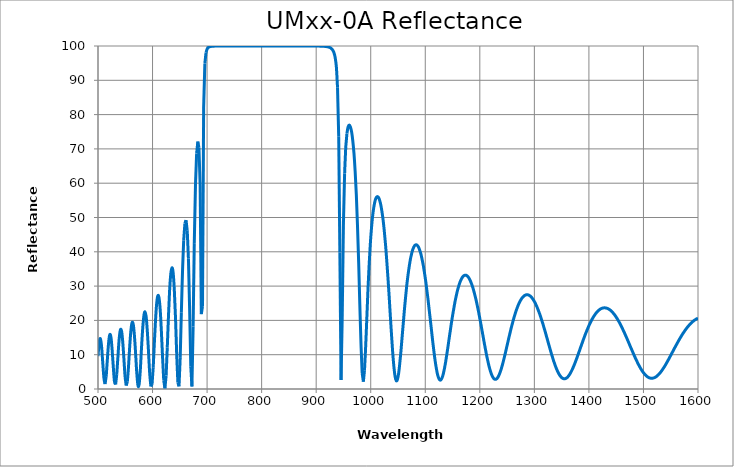
| Category | Series 0 |
|---|---|
| 500.0 | 9.57 |
| 502.2 | 13.56 |
| 504.3 | 14.68 |
| 506.5 | 12.51 |
| 508.6 | 7.95 |
| 510.8 | 3.28 |
| 512.9 | 1.44 |
| 515.1 | 3.77 |
| 517.2 | 8.71 |
| 519.4 | 13.4 |
| 521.5 | 15.81 |
| 523.7 | 15.15 |
| 525.8 | 11.64 |
| 528.0 | 6.57 |
| 530.1 | 2.28 |
| 532.3 | 1.32 |
| 534.4 | 4.34 |
| 536.6 | 9.57 |
| 538.7 | 14.42 |
| 540.9 | 17.14 |
| 543.1 | 16.98 |
| 545.2 | 14.02 |
| 547.4 | 9.05 |
| 549.5 | 3.89 |
| 551.7 | 1.01 |
| 553.8 | 2.11 |
| 556.0 | 6.63 |
| 558.1 | 12.33 |
| 560.3 | 16.98 |
| 562.4 | 19.32 |
| 564.6 | 18.87 |
| 566.7 | 15.71 |
| 568.9 | 10.52 |
| 571.0 | 4.87 |
| 573.2 | 1.1 |
| 575.3 | 1.24 |
| 577.5 | 5.36 |
| 579.6 | 11.5 |
| 581.8 | 17.31 |
| 584.0 | 21.21 |
| 586.1 | 22.52 |
| 588.3 | 21.02 |
| 590.4 | 16.92 |
| 592.6 | 10.92 |
| 594.7 | 4.69 |
| 596.9 | 0.76 |
| 599.0 | 1.27 |
| 601.2 | 6.2 |
| 603.3 | 13.34 |
| 605.5 | 20.15 |
| 607.6 | 25.01 |
| 609.8 | 27.21 |
| 611.9 | 26.53 |
| 614.1 | 22.95 |
| 616.2 | 16.8 |
| 618.4 | 9.18 |
| 620.5 | 2.55 |
| 622.7 | 0.2 |
| 624.9 | 3.91 |
| 627.0 | 12.05 |
| 629.2 | 21.22 |
| 631.3 | 28.81 |
| 633.5 | 33.64 |
| 635.6 | 35.36 |
| 637.8 | 33.84 |
| 639.9 | 28.94 |
| 642.1 | 20.74 |
| 644.2 | 10.47 |
| 646.4 | 1.91 |
| 648.5 | 0.77 |
| 650.7 | 9.07 |
| 652.8 | 22.24 |
| 655.0 | 34.56 |
| 657.1 | 43.37 |
| 659.3 | 48.23 |
| 661.4 | 49.23 |
| 663.6 | 46.12 |
| 665.8 | 38.01 |
| 667.9 | 23.88 |
| 670.1 | 6.56 |
| 672.2 | 0.75 |
| 674.4 | 18.24 |
| 676.5 | 42.53 |
| 678.7 | 59.47 |
| 680.8 | 68.63 |
| 683.0 | 72.14 |
| 685.1 | 70.33 |
| 687.3 | 59.17 |
| 689.4 | 21.83 |
| 691.6 | 24.13 |
| 693.7 | 82.24 |
| 695.9 | 94.91 |
| 698.0 | 98.08 |
| 700.2 | 99.14 |
| 702.3 | 99.56 |
| 704.5 | 99.76 |
| 706.7 | 99.86 |
| 708.8 | 99.91 |
| 711.0 | 99.94 |
| 713.1 | 99.96 |
| 715.3 | 99.97 |
| 717.4 | 99.98 |
| 719.6 | 99.99 |
| 721.7 | 99.99 |
| 723.9 | 99.99 |
| 726.0 | 99.99 |
| 728.2 | 100 |
| 730.3 | 100 |
| 732.5 | 100 |
| 734.6 | 100 |
| 736.8 | 100 |
| 738.9 | 100 |
| 741.1 | 100 |
| 743.2 | 100 |
| 745.4 | 100 |
| 747.6 | 100 |
| 749.7 | 100 |
| 751.9 | 100 |
| 754.0 | 100 |
| 756.2 | 100 |
| 758.3 | 100 |
| 760.5 | 100 |
| 762.6 | 100 |
| 764.8 | 100 |
| 766.9 | 100 |
| 769.1 | 100 |
| 771.2 | 100 |
| 773.4 | 100 |
| 775.5 | 100 |
| 777.7 | 100 |
| 779.8 | 100 |
| 782.0 | 100 |
| 784.1 | 100 |
| 786.3 | 100 |
| 788.5 | 100 |
| 790.6 | 100 |
| 792.8 | 100 |
| 794.9 | 100 |
| 797.1 | 100 |
| 799.2 | 100 |
| 801.4 | 100 |
| 803.5 | 100 |
| 805.7 | 100 |
| 807.8 | 100 |
| 810.0 | 100 |
| 812.1 | 100 |
| 814.3 | 100 |
| 816.4 | 100 |
| 818.6 | 100 |
| 820.7 | 100 |
| 822.9 | 100 |
| 825.0 | 100 |
| 827.2 | 100 |
| 829.4 | 100 |
| 831.5 | 100 |
| 833.7 | 100 |
| 835.8 | 100 |
| 838.0 | 100 |
| 840.1 | 100 |
| 842.3 | 100 |
| 844.4 | 100 |
| 846.6 | 100 |
| 848.7 | 100 |
| 850.9 | 100 |
| 853.0 | 100 |
| 855.2 | 100 |
| 857.3 | 100 |
| 859.5 | 100 |
| 861.6 | 100 |
| 863.8 | 100 |
| 865.9 | 100 |
| 868.1 | 100 |
| 870.3 | 100 |
| 872.4 | 100 |
| 874.6 | 100 |
| 876.7 | 100 |
| 878.9 | 100 |
| 881.0 | 100 |
| 883.2 | 100 |
| 885.3 | 99.99 |
| 887.5 | 99.99 |
| 889.6 | 99.99 |
| 891.8 | 99.99 |
| 893.9 | 99.99 |
| 896.1 | 99.99 |
| 898.2 | 99.98 |
| 900.4 | 99.98 |
| 902.5 | 99.98 |
| 904.7 | 99.97 |
| 906.8 | 99.96 |
| 909.0 | 99.95 |
| 911.2 | 99.94 |
| 913.3 | 99.92 |
| 915.5 | 99.89 |
| 917.6 | 99.85 |
| 919.8 | 99.8 |
| 921.9 | 99.73 |
| 924.1 | 99.62 |
| 926.2 | 99.45 |
| 928.4 | 99.18 |
| 930.5 | 98.74 |
| 932.7 | 97.99 |
| 934.8 | 96.61 |
| 937.0 | 93.9 |
| 939.1 | 87.98 |
| 941.3 | 73.68 |
| 943.4 | 39.78 |
| 945.6 | 2.61 |
| 947.7 | 20.72 |
| 949.9 | 47.8 |
| 952.1 | 62.82 |
| 954.2 | 70.54 |
| 956.4 | 74.53 |
| 958.5 | 76.42 |
| 960.7 | 76.94 |
| 962.8 | 76.41 |
| 965.0 | 74.9 |
| 967.1 | 72.38 |
| 969.3 | 68.68 |
| 971.4 | 63.55 |
| 973.6 | 56.67 |
| 975.7 | 47.77 |
| 977.9 | 36.84 |
| 980.0 | 24.6 |
| 982.2 | 12.92 |
| 984.3 | 4.66 |
| 986.5 | 2.13 |
| 988.6 | 5.47 |
| 990.8 | 12.68 |
| 993.0 | 21.3 |
| 995.1 | 29.63 |
| 997.3 | 36.84 |
| 999.4 | 42.7 |
| 1001.6 | 47.29 |
| 1003.7 | 50.74 |
| 1005.9 | 53.23 |
| 1008.0 | 54.89 |
| 1010.2 | 55.82 |
| 1012.3 | 56.1 |
| 1014.5 | 55.78 |
| 1016.6 | 54.88 |
| 1018.8 | 53.41 |
| 1020.9 | 51.37 |
| 1023.1 | 48.73 |
| 1025.2 | 45.48 |
| 1027.4 | 41.61 |
| 1029.5 | 37.15 |
| 1031.7 | 32.15 |
| 1033.9 | 26.73 |
| 1036.0 | 21.11 |
| 1038.2 | 15.6 |
| 1040.3 | 10.58 |
| 1042.5 | 6.48 |
| 1044.6 | 3.68 |
| 1046.8 | 2.42 |
| 1048.9 | 2.74 |
| 1051.1 | 4.5 |
| 1053.2 | 7.39 |
| 1055.4 | 11.03 |
| 1057.5 | 15.07 |
| 1059.7 | 19.21 |
| 1061.8 | 23.21 |
| 1064.0 | 26.92 |
| 1066.1 | 30.25 |
| 1068.3 | 33.17 |
| 1070.5 | 35.65 |
| 1072.6 | 37.7 |
| 1074.8 | 39.34 |
| 1076.9 | 40.57 |
| 1079.1 | 41.42 |
| 1081.2 | 41.91 |
| 1083.4 | 42.05 |
| 1085.5 | 41.85 |
| 1087.7 | 41.32 |
| 1089.8 | 40.48 |
| 1092.0 | 39.32 |
| 1094.1 | 37.85 |
| 1096.3 | 36.08 |
| 1098.4 | 34.02 |
| 1100.6 | 31.69 |
| 1102.7 | 29.1 |
| 1104.9 | 26.3 |
| 1107.0 | 23.33 |
| 1109.2 | 20.24 |
| 1111.4 | 17.12 |
| 1113.5 | 14.06 |
| 1115.7 | 11.16 |
| 1117.8 | 8.53 |
| 1120.0 | 6.28 |
| 1122.1 | 4.51 |
| 1124.3 | 3.29 |
| 1126.4 | 2.67 |
| 1128.6 | 2.66 |
| 1130.7 | 3.23 |
| 1132.9 | 4.32 |
| 1135.0 | 5.86 |
| 1137.2 | 7.75 |
| 1139.3 | 9.9 |
| 1141.5 | 12.2 |
| 1143.6 | 14.57 |
| 1145.8 | 16.93 |
| 1147.9 | 19.24 |
| 1150.1 | 21.43 |
| 1152.3 | 23.47 |
| 1154.4 | 25.34 |
| 1156.6 | 27.03 |
| 1158.7 | 28.51 |
| 1160.9 | 29.79 |
| 1163.0 | 30.86 |
| 1165.2 | 31.73 |
| 1167.3 | 32.39 |
| 1169.5 | 32.86 |
| 1171.6 | 33.12 |
| 1173.8 | 33.19 |
| 1175.9 | 33.08 |
| 1178.1 | 32.77 |
| 1180.2 | 32.29 |
| 1182.4 | 31.63 |
| 1184.5 | 30.8 |
| 1186.7 | 29.81 |
| 1188.8 | 28.66 |
| 1191.0 | 27.35 |
| 1193.2 | 25.91 |
| 1195.3 | 24.35 |
| 1197.5 | 22.67 |
| 1199.6 | 20.9 |
| 1201.8 | 19.06 |
| 1203.9 | 17.17 |
| 1206.1 | 15.27 |
| 1208.2 | 13.38 |
| 1210.4 | 11.54 |
| 1212.5 | 9.79 |
| 1214.7 | 8.17 |
| 1216.8 | 6.71 |
| 1219.0 | 5.44 |
| 1221.1 | 4.4 |
| 1223.3 | 3.61 |
| 1225.4 | 3.08 |
| 1227.6 | 2.83 |
| 1229.7 | 2.85 |
| 1231.9 | 3.14 |
| 1234.1 | 3.68 |
| 1236.2 | 4.44 |
| 1238.4 | 5.4 |
| 1240.5 | 6.53 |
| 1242.7 | 7.8 |
| 1244.8 | 9.16 |
| 1247.0 | 10.6 |
| 1249.1 | 12.08 |
| 1251.3 | 13.57 |
| 1253.4 | 15.05 |
| 1255.6 | 16.49 |
| 1257.7 | 17.89 |
| 1259.9 | 19.21 |
| 1262.0 | 20.46 |
| 1264.2 | 21.63 |
| 1266.3 | 22.69 |
| 1268.5 | 23.66 |
| 1270.6 | 24.52 |
| 1272.8 | 25.27 |
| 1275.0 | 25.92 |
| 1277.1 | 26.45 |
| 1279.3 | 26.87 |
| 1281.4 | 27.18 |
| 1283.6 | 27.39 |
| 1285.7 | 27.48 |
| 1287.9 | 27.47 |
| 1290.0 | 27.35 |
| 1292.2 | 27.13 |
| 1294.3 | 26.81 |
| 1296.5 | 26.4 |
| 1298.6 | 25.88 |
| 1300.8 | 25.28 |
| 1302.9 | 24.59 |
| 1305.1 | 23.81 |
| 1307.2 | 22.95 |
| 1309.4 | 22.02 |
| 1311.5 | 21.03 |
| 1313.7 | 19.97 |
| 1315.9 | 18.86 |
| 1318.0 | 17.7 |
| 1320.2 | 16.52 |
| 1322.3 | 15.31 |
| 1324.5 | 14.08 |
| 1326.6 | 12.86 |
| 1328.8 | 11.65 |
| 1330.9 | 10.47 |
| 1333.1 | 9.34 |
| 1335.2 | 8.25 |
| 1337.4 | 7.24 |
| 1339.5 | 6.31 |
| 1341.7 | 5.48 |
| 1343.8 | 4.75 |
| 1346.0 | 4.14 |
| 1348.1 | 3.66 |
| 1350.3 | 3.3 |
| 1352.4 | 3.08 |
| 1354.6 | 2.99 |
| 1356.8 | 3.03 |
| 1358.9 | 3.2 |
| 1361.1 | 3.5 |
| 1363.2 | 3.92 |
| 1365.4 | 4.44 |
| 1367.5 | 5.06 |
| 1369.7 | 5.76 |
| 1371.8 | 6.54 |
| 1374.0 | 7.38 |
| 1376.1 | 8.27 |
| 1378.3 | 9.2 |
| 1380.4 | 10.16 |
| 1382.6 | 11.13 |
| 1384.7 | 12.1 |
| 1386.9 | 13.07 |
| 1389.0 | 14.03 |
| 1391.2 | 14.97 |
| 1393.3 | 15.88 |
| 1395.5 | 16.75 |
| 1397.7 | 17.59 |
| 1399.8 | 18.38 |
| 1402.0 | 19.12 |
| 1404.1 | 19.82 |
| 1406.3 | 20.46 |
| 1408.4 | 21.04 |
| 1410.6 | 21.57 |
| 1412.7 | 22.04 |
| 1414.9 | 22.45 |
| 1417.0 | 22.81 |
| 1419.2 | 23.1 |
| 1421.3 | 23.33 |
| 1423.5 | 23.5 |
| 1425.6 | 23.61 |
| 1427.8 | 23.66 |
| 1429.9 | 23.65 |
| 1432.1 | 23.59 |
| 1434.2 | 23.47 |
| 1436.4 | 23.29 |
| 1438.6 | 23.06 |
| 1440.7 | 22.77 |
| 1442.9 | 22.43 |
| 1445.0 | 22.04 |
| 1447.2 | 21.61 |
| 1449.3 | 21.12 |
| 1451.5 | 20.59 |
| 1453.6 | 20.02 |
| 1455.8 | 19.41 |
| 1457.9 | 18.77 |
| 1460.1 | 18.09 |
| 1462.2 | 17.37 |
| 1464.4 | 16.64 |
| 1466.5 | 15.88 |
| 1468.7 | 15.1 |
| 1470.8 | 14.31 |
| 1473.0 | 13.5 |
| 1475.1 | 12.7 |
| 1477.3 | 11.89 |
| 1479.5 | 11.09 |
| 1481.6 | 10.3 |
| 1483.8 | 9.52 |
| 1485.9 | 8.77 |
| 1488.1 | 8.05 |
| 1490.2 | 7.35 |
| 1492.4 | 6.7 |
| 1494.5 | 6.09 |
| 1496.7 | 5.52 |
| 1498.8 | 5.01 |
| 1501.0 | 4.56 |
| 1503.1 | 4.16 |
| 1505.3 | 3.82 |
| 1507.4 | 3.55 |
| 1509.6 | 3.35 |
| 1511.7 | 3.21 |
| 1513.9 | 3.14 |
| 1516.0 | 3.14 |
| 1518.2 | 3.2 |
| 1520.4 | 3.32 |
| 1522.5 | 3.51 |
| 1524.7 | 3.76 |
| 1526.8 | 4.07 |
| 1529.0 | 4.42 |
| 1531.1 | 4.83 |
| 1533.3 | 5.28 |
| 1535.4 | 5.77 |
| 1537.6 | 6.3 |
| 1539.7 | 6.85 |
| 1541.9 | 7.44 |
| 1544.0 | 8.04 |
| 1546.2 | 8.67 |
| 1548.3 | 9.3 |
| 1550.5 | 9.95 |
| 1552.6 | 10.59 |
| 1554.8 | 11.24 |
| 1556.9 | 11.89 |
| 1559.1 | 12.53 |
| 1561.3 | 13.16 |
| 1563.4 | 13.78 |
| 1565.6 | 14.39 |
| 1567.7 | 14.97 |
| 1569.9 | 15.54 |
| 1572.0 | 16.09 |
| 1574.2 | 16.61 |
| 1576.3 | 17.11 |
| 1578.5 | 17.58 |
| 1580.6 | 18.02 |
| 1582.8 | 18.43 |
| 1584.9 | 18.82 |
| 1587.1 | 19.18 |
| 1589.2 | 19.5 |
| 1591.4 | 19.79 |
| 1593.5 | 20.05 |
| 1595.7 | 20.28 |
| 1597.8 | 20.48 |
| 1600.0 | 20.65 |